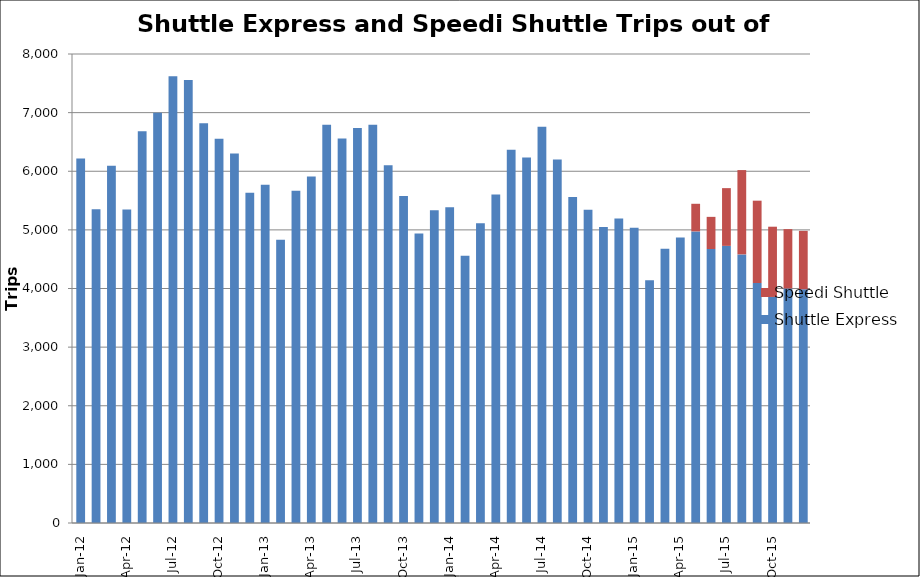
| Category | Shuttle Express | Speedi Shuttle |
|---|---|---|
| 2012-01-31 | 6218 | 0 |
| 2012-02-29 | 5351 | 0 |
| 2012-03-31 | 6093 | 0 |
| 2012-04-30 | 5348 | 0 |
| 2012-05-31 | 6683 | 0 |
| 2012-06-30 | 6998 | 0 |
| 2012-07-31 | 7622 | 0 |
| 2012-08-31 | 7558 | 0 |
| 2012-09-30 | 6817 | 0 |
| 2012-10-31 | 6553 | 0 |
| 2012-11-30 | 6301 | 0 |
| 2012-12-31 | 5632 | 0 |
| 2013-01-31 | 5770 | 0 |
| 2013-02-28 | 4833 | 0 |
| 2013-03-31 | 5669 | 0 |
| 2013-04-30 | 5912 | 0 |
| 2013-05-31 | 6793 | 0 |
| 2013-06-30 | 6559 | 0 |
| 2013-07-31 | 6738 | 0 |
| 2013-08-31 | 6793 | 0 |
| 2013-09-30 | 6101 | 0 |
| 2013-10-31 | 5576 | 0 |
| 2013-11-30 | 4939 | 0 |
| 2013-12-31 | 5336 | 0 |
| 2014-01-31 | 5388 | 0 |
| 2014-02-28 | 4560 | 0 |
| 2014-03-31 | 5115 | 0 |
| 2014-04-30 | 5603 | 0 |
| 2014-05-31 | 6366 | 0 |
| 2014-06-30 | 6233 | 0 |
| 2014-07-31 | 6761 | 0 |
| 2014-08-31 | 6202 | 0 |
| 2014-09-30 | 5559 | 0 |
| 2014-10-31 | 5343 | 0 |
| 2014-11-30 | 5048 | 0 |
| 2014-12-31 | 5196 | 0 |
| 2015-01-31 | 5038 | 0 |
| 2015-02-28 | 4140 | 0 |
| 2015-03-31 | 4680 | 0 |
| 2015-04-30 | 4870 | 0 |
| 2015-05-31 | 4974 | 471 |
| 2015-06-30 | 4674 | 548 |
| 2015-07-31 | 4727 | 985 |
| 2015-08-31 | 4582 | 1438 |
| 2015-09-30 | 4094 | 1404 |
| 2015-10-31 | 3856 | 1198 |
| 2015-11-30 | 4001 | 1012 |
| 2015-12-31 | 3987 | 996 |